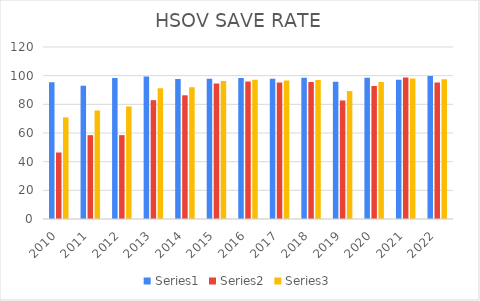
| Category | Series 0 | Series 1 | Series 2 |
|---|---|---|---|
| 2010.0 | 95.4 | 46.4 | 70.9 |
| 2011.0 | 92.9 | 58.5 | 75.7 |
| 2012.0 | 98.4 | 58.5 | 78.5 |
| 2013.0 | 99.4 | 82.9 | 91.2 |
| 2014.0 | 97.7 | 86.3 | 92 |
| 2015.0 | 97.8 | 94.6 | 96.2 |
| 2016.0 | 98.4 | 95.9 | 97.2 |
| 2017.0 | 97.8 | 95.3 | 96.6 |
| 2018.0 | 98.5 | 95.5 | 97 |
| 2019.0 | 95.8 | 82.7 | 89.25 |
| 2020.0 | 98.5 | 92.8 | 95.6 |
| 2021.0 | 97.2 | 98.8 | 98 |
| 2022.0 | 99.8 | 95.3 | 97.5 |